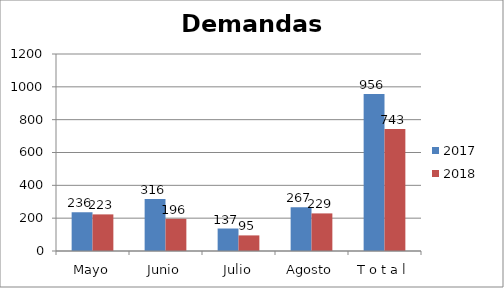
| Category | 2017 | 2018 |
|---|---|---|
| Mayo | 236 | 223 |
| Junio | 316 | 196 |
| Julio | 137 | 95 |
| Agosto | 267 | 229 |
| T o t a l | 956 | 743 |